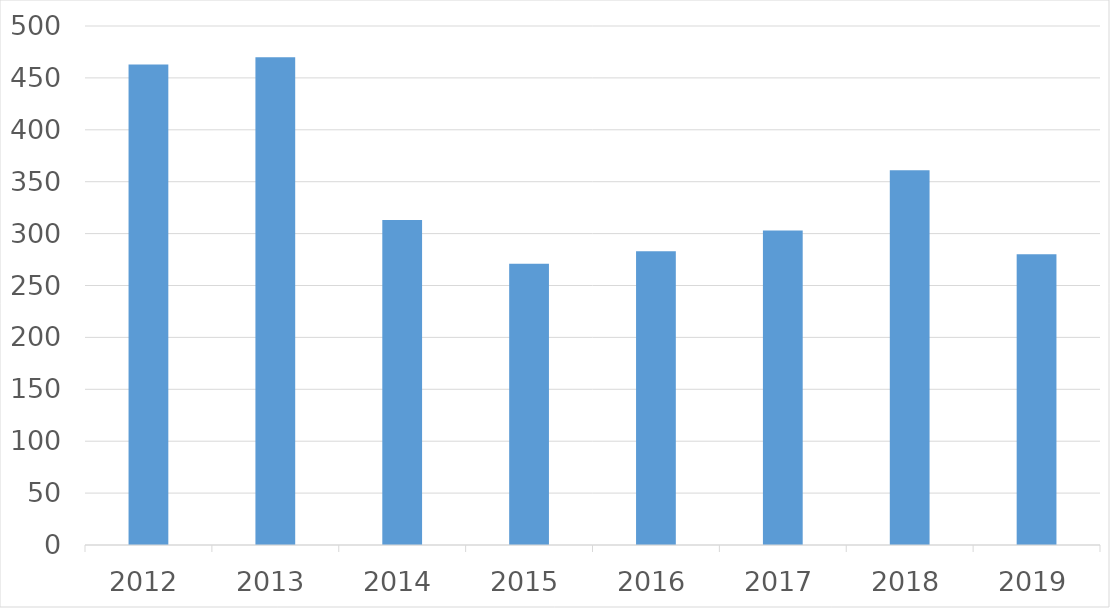
| Category | Series 0 |
|---|---|
| 2012 | 463 |
| 2013 | 470 |
| 2014 | 313 |
| 2015 | 271 |
| 2016 | 283 |
| 2017 | 303 |
| 2018 | 361 |
| 2019 | 280 |